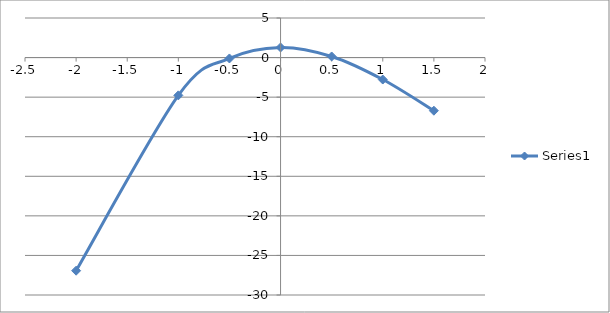
| Category | Series 0 |
|---|---|
| -2.0 | -26.928 |
| -1.0 | -4.776 |
| -0.5 | -0.112 |
| 0.0 | 1.276 |
| 0.5 | 0.138 |
| 1.0 | -2.776 |
| 1.5 | -6.714 |